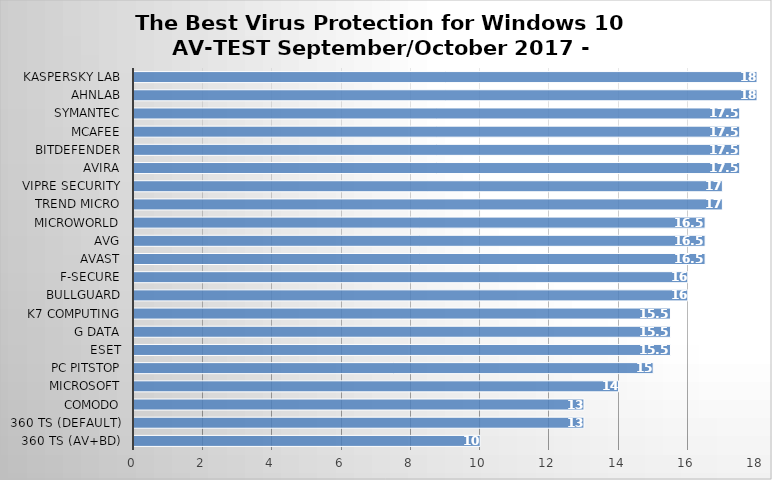
| Category | Series 0 |
|---|---|
| 360 TS (AV+BD) | 10 |
| 360 TS (Default) | 13 |
| Comodo | 13 |
| Microsoft | 14 |
| PC Pitstop | 15 |
| ESET | 15.5 |
| G Data | 15.5 |
| K7 Computing | 15.5 |
| BullGuard | 16 |
| F-Secure | 16 |
| Avast | 16.5 |
| AVG | 16.5 |
| Microworld | 16.5 |
| Trend Micro | 17 |
| VIPRE Security | 17 |
| Avira | 17.5 |
| Bitdefender | 17.5 |
| McAfee | 17.5 |
| Symantec | 17.5 |
| AhnLab | 18 |
| Kaspersky Lab | 18 |